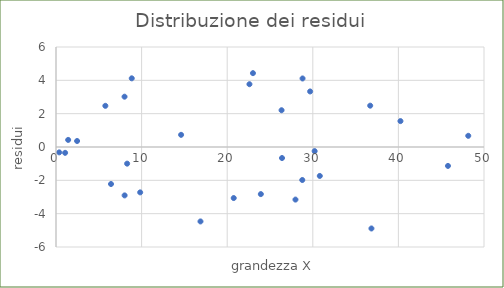
| Category | Series 0 |
|---|---|
| 20.7613512722473 | -3.063 |
| 26.3503519248319 | 2.206 |
| 30.2153290317034 | -0.246 |
| 2.46430981149987 | 0.36 |
| 8.00732214504332 | 3.018 |
| 8.01766489368162 | -2.904 |
| 16.8792167133997 | -4.467 |
| 6.42613427383618 | -2.221 |
| 45.7912927112614 | -1.135 |
| 5.76619697339087 | 2.47 |
| 28.7713469637085 | -1.98 |
| 0.378863282394903 | -0.322 |
| 30.81681844797 | -1.736 |
| 36.8505865134389 | -4.888 |
| 48.1609107658769 | 0.671 |
| 40.2401202874834 | 1.554 |
| 8.30953112345697 | -0.999 |
| 1.42061725284139 | 0.425 |
| 14.6137058838877 | 0.73 |
| 28.8037239410094 | 4.112 |
| 9.83454094270923 | -2.722 |
| 23.0095716543992 | 4.431 |
| 36.705210088529 | 2.48 |
| 23.9297411471892 | -2.827 |
| 22.5993334854271 | 3.767 |
| 26.4030417642501 | -0.662 |
| 8.84942602793245 | 4.12 |
| 29.6880903324067 | 3.333 |
| 27.9755047025996 | -3.155 |
| 1.0652482202328 | -0.35 |